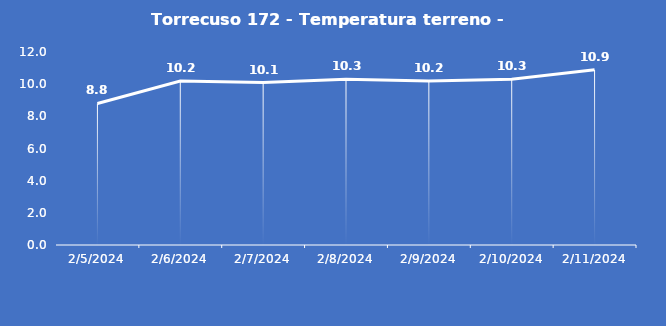
| Category | Torrecuso 172 - Temperatura terreno - Grezzo (°C) |
|---|---|
| 2/5/24 | 8.8 |
| 2/6/24 | 10.2 |
| 2/7/24 | 10.1 |
| 2/8/24 | 10.3 |
| 2/9/24 | 10.2 |
| 2/10/24 | 10.3 |
| 2/11/24 | 10.9 |